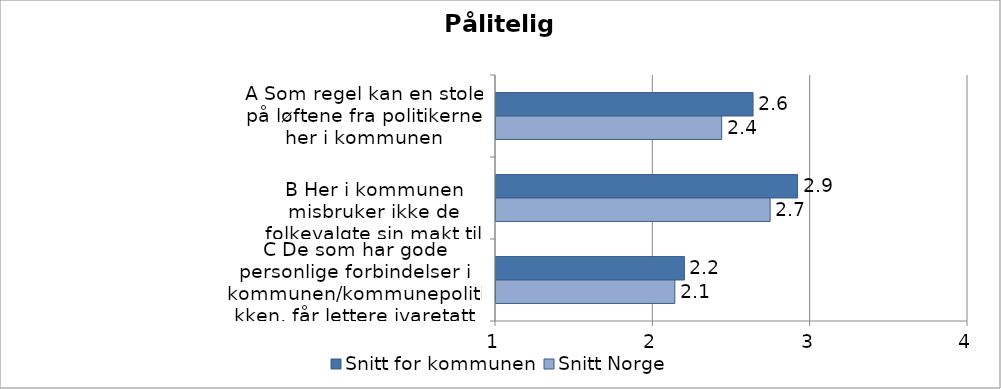
| Category | Snitt for kommunen | Snitt Norge |
|---|---|---|
| A Som regel kan en stole på løftene fra politikerne her i kommunen | 2.634 | 2.434 |
|  
B Her i kommunen misbruker ikke de folkevalgte sin makt til personlig fordel  | 2.917 | 2.742 |
| C De som har gode personlige forbindelser i kommunen/kommunepolitikken, får lettere ivaretatt sine interesser | 2.197 | 2.137 |